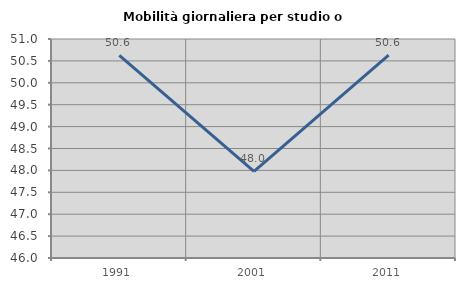
| Category | Mobilità giornaliera per studio o lavoro |
|---|---|
| 1991.0 | 50.624 |
| 2001.0 | 47.98 |
| 2011.0 | 50.632 |